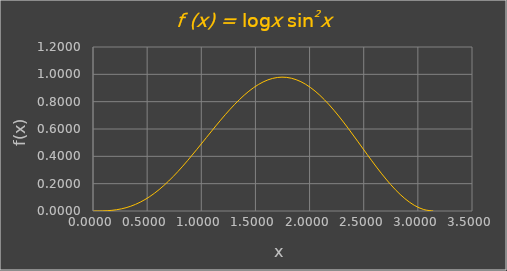
| Category | f (x) |
|---|---|
| 0.0 | 0 |
| 0.08726646259971647 | 0.001 |
| 0.17453292519943295 | 0.005 |
| 0.2617993877991494 | 0.016 |
| 0.3490658503988659 | 0.035 |
| 0.4363323129985824 | 0.065 |
| 0.5235987755982988 | 0.105 |
| 0.6108652381980153 | 0.157 |
| 0.6981317007977318 | 0.219 |
| 0.7853981633974483 | 0.29 |
| 0.8726646259971648 | 0.368 |
| 0.9599310885968813 | 0.452 |
| 1.0471975511965976 | 0.537 |
| 1.134464013796314 | 0.623 |
| 1.2217304763960304 | 0.705 |
| 1.3089969389957468 | 0.781 |
| 1.3962634015954631 | 0.848 |
| 1.4835298641951795 | 0.903 |
| 1.570796326794896 | 0.944 |
| 1.6580627893946123 | 0.97 |
| 1.7453292519943286 | 0.979 |
| 1.832595714594045 | 0.971 |
| 1.9198621771937614 | 0.946 |
| 2.007128639793478 | 0.904 |
| 2.0943951023931944 | 0.847 |
| 2.1816615649929108 | 0.777 |
| 2.268928027592627 | 0.695 |
| 2.3561944901923435 | 0.605 |
| 2.44346095279206 | 0.511 |
| 2.5307274153917763 | 0.415 |
| 2.6179938779914926 | 0.321 |
| 2.705260340591209 | 0.234 |
| 2.7925268031909254 | 0.156 |
| 2.8797932657906418 | 0.091 |
| 2.967059728390358 | 0.042 |
| 3.0543261909900745 | 0.011 |
| 3.141592653589791 | 0 |